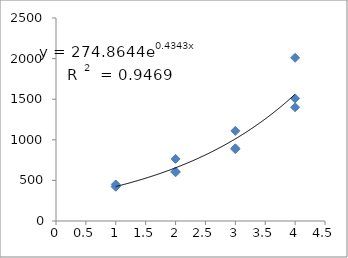
| Category | Series 0 |
|---|---|
| 1.0 | 450 |
| 1.0 | 426 |
| 1.0 | 422 |
| 2.0 | 765 |
| 2.0 | 600 |
| 2.0 | 610 |
| 3.0 | 1110 |
| 3.0 | 885 |
| 3.0 | 895 |
| 4.0 | 1400 |
| 4.0 | 2010 |
| 4.0 | 1510 |